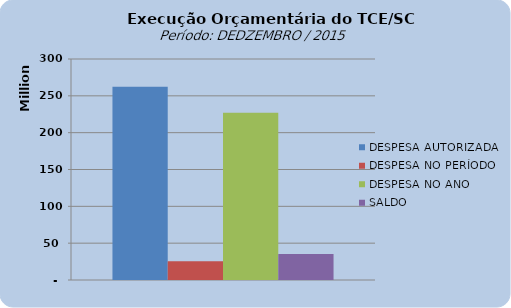
| Category | DESPESA AUTORIZADA | DESPESA NO PERÍODO | DESPESA NO ANO | SALDO |
|---|---|---|---|---|
| 0 | 262258783.63 | 25471139.7 | 227023581.32 | 35235202.31 |